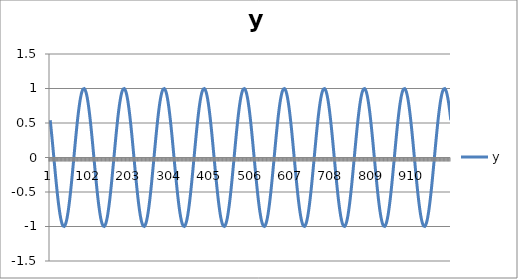
| Category | y |
|---|---|
| 0 | 0.54 |
| 1 | 0.486 |
| 2 | 0.431 |
| 3 | 0.373 |
| 4 | 0.314 |
| 5 | 0.254 |
| 6 | 0.193 |
| 7 | 0.131 |
| 8 | 0.068 |
| 9 | 0.005 |
| 10 | -0.057 |
| 11 | -0.12 |
| 12 | -0.182 |
| 13 | -0.244 |
| 14 | -0.304 |
| 15 | -0.363 |
| 16 | -0.421 |
| 17 | -0.477 |
| 18 | -0.531 |
| 19 | -0.583 |
| 20 | -0.633 |
| 21 | -0.681 |
| 22 | -0.725 |
| 23 | -0.767 |
| 24 | -0.806 |
| 25 | -0.841 |
| 26 | -0.874 |
| 27 | -0.903 |
| 28 | -0.928 |
| 29 | -0.949 |
| 30 | -0.967 |
| 31 | -0.981 |
| 32 | -0.991 |
| 33 | -0.998 |
| 34 | -1 |
| 35 | -0.998 |
| 36 | -0.993 |
| 37 | -0.983 |
| 38 | -0.97 |
| 39 | -0.953 |
| 40 | -0.932 |
| 41 | -0.907 |
| 42 | -0.879 |
| 43 | -0.847 |
| 44 | -0.812 |
| 45 | -0.774 |
| 46 | -0.733 |
| 47 | -0.688 |
| 48 | -0.642 |
| 49 | -0.592 |
| 50 | -0.54 |
| 51 | -0.486 |
| 52 | -0.431 |
| 53 | -0.373 |
| 54 | -0.314 |
| 55 | -0.254 |
| 56 | -0.193 |
| 57 | -0.131 |
| 58 | -0.068 |
| 59 | -0.005 |
| 60 | 0.057 |
| 61 | 0.12 |
| 62 | 0.182 |
| 63 | 0.244 |
| 64 | 0.304 |
| 65 | 0.363 |
| 66 | 0.421 |
| 67 | 0.477 |
| 68 | 0.531 |
| 69 | 0.583 |
| 70 | 0.633 |
| 71 | 0.681 |
| 72 | 0.725 |
| 73 | 0.767 |
| 74 | 0.806 |
| 75 | 0.841 |
| 76 | 0.874 |
| 77 | 0.903 |
| 78 | 0.928 |
| 79 | 0.949 |
| 80 | 0.967 |
| 81 | 0.981 |
| 82 | 0.991 |
| 83 | 0.998 |
| 84 | 1 |
| 85 | 0.998 |
| 86 | 0.993 |
| 87 | 0.983 |
| 88 | 0.97 |
| 89 | 0.953 |
| 90 | 0.932 |
| 91 | 0.907 |
| 92 | 0.879 |
| 93 | 0.847 |
| 94 | 0.812 |
| 95 | 0.774 |
| 96 | 0.733 |
| 97 | 0.688 |
| 98 | 0.642 |
| 99 | 0.592 |
| 100 | 0.54 |
| 101 | 0.486 |
| 102 | 0.431 |
| 103 | 0.373 |
| 104 | 0.314 |
| 105 | 0.254 |
| 106 | 0.193 |
| 107 | 0.131 |
| 108 | 0.068 |
| 109 | 0.005 |
| 110 | -0.057 |
| 111 | -0.12 |
| 112 | -0.182 |
| 113 | -0.244 |
| 114 | -0.304 |
| 115 | -0.363 |
| 116 | -0.421 |
| 117 | -0.477 |
| 118 | -0.531 |
| 119 | -0.583 |
| 120 | -0.633 |
| 121 | -0.681 |
| 122 | -0.725 |
| 123 | -0.767 |
| 124 | -0.806 |
| 125 | -0.841 |
| 126 | -0.874 |
| 127 | -0.903 |
| 128 | -0.928 |
| 129 | -0.949 |
| 130 | -0.967 |
| 131 | -0.981 |
| 132 | -0.991 |
| 133 | -0.998 |
| 134 | -1 |
| 135 | -0.998 |
| 136 | -0.993 |
| 137 | -0.983 |
| 138 | -0.97 |
| 139 | -0.953 |
| 140 | -0.932 |
| 141 | -0.907 |
| 142 | -0.879 |
| 143 | -0.847 |
| 144 | -0.812 |
| 145 | -0.774 |
| 146 | -0.733 |
| 147 | -0.688 |
| 148 | -0.642 |
| 149 | -0.592 |
| 150 | -0.54 |
| 151 | -0.486 |
| 152 | -0.431 |
| 153 | -0.373 |
| 154 | -0.314 |
| 155 | -0.254 |
| 156 | -0.193 |
| 157 | -0.131 |
| 158 | -0.068 |
| 159 | -0.005 |
| 160 | 0.057 |
| 161 | 0.12 |
| 162 | 0.182 |
| 163 | 0.244 |
| 164 | 0.304 |
| 165 | 0.363 |
| 166 | 0.421 |
| 167 | 0.477 |
| 168 | 0.531 |
| 169 | 0.583 |
| 170 | 0.633 |
| 171 | 0.681 |
| 172 | 0.725 |
| 173 | 0.767 |
| 174 | 0.806 |
| 175 | 0.841 |
| 176 | 0.874 |
| 177 | 0.903 |
| 178 | 0.928 |
| 179 | 0.949 |
| 180 | 0.967 |
| 181 | 0.981 |
| 182 | 0.991 |
| 183 | 0.998 |
| 184 | 1 |
| 185 | 0.998 |
| 186 | 0.993 |
| 187 | 0.983 |
| 188 | 0.97 |
| 189 | 0.953 |
| 190 | 0.932 |
| 191 | 0.907 |
| 192 | 0.879 |
| 193 | 0.847 |
| 194 | 0.812 |
| 195 | 0.774 |
| 196 | 0.733 |
| 197 | 0.688 |
| 198 | 0.642 |
| 199 | 0.592 |
| 200 | 0.54 |
| 201 | 0.486 |
| 202 | 0.431 |
| 203 | 0.373 |
| 204 | 0.314 |
| 205 | 0.254 |
| 206 | 0.193 |
| 207 | 0.131 |
| 208 | 0.068 |
| 209 | 0.005 |
| 210 | -0.057 |
| 211 | -0.12 |
| 212 | -0.182 |
| 213 | -0.244 |
| 214 | -0.304 |
| 215 | -0.363 |
| 216 | -0.421 |
| 217 | -0.477 |
| 218 | -0.531 |
| 219 | -0.583 |
| 220 | -0.633 |
| 221 | -0.681 |
| 222 | -0.725 |
| 223 | -0.767 |
| 224 | -0.806 |
| 225 | -0.841 |
| 226 | -0.874 |
| 227 | -0.903 |
| 228 | -0.928 |
| 229 | -0.949 |
| 230 | -0.967 |
| 231 | -0.981 |
| 232 | -0.991 |
| 233 | -0.998 |
| 234 | -1 |
| 235 | -0.998 |
| 236 | -0.993 |
| 237 | -0.983 |
| 238 | -0.97 |
| 239 | -0.953 |
| 240 | -0.932 |
| 241 | -0.907 |
| 242 | -0.879 |
| 243 | -0.847 |
| 244 | -0.812 |
| 245 | -0.774 |
| 246 | -0.733 |
| 247 | -0.688 |
| 248 | -0.642 |
| 249 | -0.592 |
| 250 | -0.54 |
| 251 | -0.486 |
| 252 | -0.431 |
| 253 | -0.373 |
| 254 | -0.314 |
| 255 | -0.254 |
| 256 | -0.193 |
| 257 | -0.131 |
| 258 | -0.068 |
| 259 | -0.005 |
| 260 | 0.057 |
| 261 | 0.12 |
| 262 | 0.182 |
| 263 | 0.244 |
| 264 | 0.304 |
| 265 | 0.363 |
| 266 | 0.421 |
| 267 | 0.477 |
| 268 | 0.531 |
| 269 | 0.583 |
| 270 | 0.633 |
| 271 | 0.681 |
| 272 | 0.725 |
| 273 | 0.767 |
| 274 | 0.806 |
| 275 | 0.841 |
| 276 | 0.874 |
| 277 | 0.903 |
| 278 | 0.928 |
| 279 | 0.949 |
| 280 | 0.967 |
| 281 | 0.981 |
| 282 | 0.991 |
| 283 | 0.998 |
| 284 | 1 |
| 285 | 0.998 |
| 286 | 0.993 |
| 287 | 0.983 |
| 288 | 0.97 |
| 289 | 0.953 |
| 290 | 0.932 |
| 291 | 0.907 |
| 292 | 0.879 |
| 293 | 0.847 |
| 294 | 0.812 |
| 295 | 0.774 |
| 296 | 0.733 |
| 297 | 0.688 |
| 298 | 0.642 |
| 299 | 0.592 |
| 300 | 0.54 |
| 301 | 0.486 |
| 302 | 0.431 |
| 303 | 0.373 |
| 304 | 0.314 |
| 305 | 0.254 |
| 306 | 0.193 |
| 307 | 0.131 |
| 308 | 0.068 |
| 309 | 0.005 |
| 310 | -0.057 |
| 311 | -0.12 |
| 312 | -0.182 |
| 313 | -0.244 |
| 314 | -0.304 |
| 315 | -0.363 |
| 316 | -0.421 |
| 317 | -0.477 |
| 318 | -0.531 |
| 319 | -0.583 |
| 320 | -0.633 |
| 321 | -0.681 |
| 322 | -0.725 |
| 323 | -0.767 |
| 324 | -0.806 |
| 325 | -0.841 |
| 326 | -0.874 |
| 327 | -0.903 |
| 328 | -0.928 |
| 329 | -0.949 |
| 330 | -0.967 |
| 331 | -0.981 |
| 332 | -0.991 |
| 333 | -0.998 |
| 334 | -1 |
| 335 | -0.998 |
| 336 | -0.993 |
| 337 | -0.983 |
| 338 | -0.97 |
| 339 | -0.953 |
| 340 | -0.932 |
| 341 | -0.907 |
| 342 | -0.879 |
| 343 | -0.847 |
| 344 | -0.812 |
| 345 | -0.774 |
| 346 | -0.733 |
| 347 | -0.688 |
| 348 | -0.642 |
| 349 | -0.592 |
| 350 | -0.54 |
| 351 | -0.486 |
| 352 | -0.431 |
| 353 | -0.373 |
| 354 | -0.314 |
| 355 | -0.254 |
| 356 | -0.193 |
| 357 | -0.131 |
| 358 | -0.068 |
| 359 | -0.005 |
| 360 | 0.057 |
| 361 | 0.12 |
| 362 | 0.182 |
| 363 | 0.244 |
| 364 | 0.304 |
| 365 | 0.363 |
| 366 | 0.421 |
| 367 | 0.477 |
| 368 | 0.531 |
| 369 | 0.583 |
| 370 | 0.633 |
| 371 | 0.681 |
| 372 | 0.725 |
| 373 | 0.767 |
| 374 | 0.806 |
| 375 | 0.841 |
| 376 | 0.874 |
| 377 | 0.903 |
| 378 | 0.928 |
| 379 | 0.949 |
| 380 | 0.967 |
| 381 | 0.981 |
| 382 | 0.991 |
| 383 | 0.998 |
| 384 | 1 |
| 385 | 0.998 |
| 386 | 0.993 |
| 387 | 0.983 |
| 388 | 0.97 |
| 389 | 0.953 |
| 390 | 0.932 |
| 391 | 0.907 |
| 392 | 0.879 |
| 393 | 0.847 |
| 394 | 0.812 |
| 395 | 0.774 |
| 396 | 0.733 |
| 397 | 0.688 |
| 398 | 0.642 |
| 399 | 0.592 |
| 400 | 0.54 |
| 401 | 0.486 |
| 402 | 0.431 |
| 403 | 0.373 |
| 404 | 0.314 |
| 405 | 0.254 |
| 406 | 0.193 |
| 407 | 0.131 |
| 408 | 0.068 |
| 409 | 0.005 |
| 410 | -0.057 |
| 411 | -0.12 |
| 412 | -0.182 |
| 413 | -0.244 |
| 414 | -0.304 |
| 415 | -0.363 |
| 416 | -0.421 |
| 417 | -0.477 |
| 418 | -0.531 |
| 419 | -0.583 |
| 420 | -0.633 |
| 421 | -0.681 |
| 422 | -0.725 |
| 423 | -0.767 |
| 424 | -0.806 |
| 425 | -0.841 |
| 426 | -0.874 |
| 427 | -0.903 |
| 428 | -0.928 |
| 429 | -0.949 |
| 430 | -0.967 |
| 431 | -0.981 |
| 432 | -0.991 |
| 433 | -0.998 |
| 434 | -1 |
| 435 | -0.998 |
| 436 | -0.993 |
| 437 | -0.983 |
| 438 | -0.97 |
| 439 | -0.953 |
| 440 | -0.932 |
| 441 | -0.907 |
| 442 | -0.879 |
| 443 | -0.847 |
| 444 | -0.812 |
| 445 | -0.774 |
| 446 | -0.733 |
| 447 | -0.688 |
| 448 | -0.642 |
| 449 | -0.592 |
| 450 | -0.54 |
| 451 | -0.486 |
| 452 | -0.431 |
| 453 | -0.373 |
| 454 | -0.314 |
| 455 | -0.254 |
| 456 | -0.193 |
| 457 | -0.131 |
| 458 | -0.068 |
| 459 | -0.005 |
| 460 | 0.057 |
| 461 | 0.12 |
| 462 | 0.182 |
| 463 | 0.244 |
| 464 | 0.304 |
| 465 | 0.363 |
| 466 | 0.421 |
| 467 | 0.477 |
| 468 | 0.531 |
| 469 | 0.583 |
| 470 | 0.633 |
| 471 | 0.681 |
| 472 | 0.725 |
| 473 | 0.767 |
| 474 | 0.806 |
| 475 | 0.841 |
| 476 | 0.874 |
| 477 | 0.903 |
| 478 | 0.928 |
| 479 | 0.949 |
| 480 | 0.967 |
| 481 | 0.981 |
| 482 | 0.991 |
| 483 | 0.998 |
| 484 | 1 |
| 485 | 0.998 |
| 486 | 0.993 |
| 487 | 0.983 |
| 488 | 0.97 |
| 489 | 0.953 |
| 490 | 0.932 |
| 491 | 0.907 |
| 492 | 0.879 |
| 493 | 0.847 |
| 494 | 0.812 |
| 495 | 0.774 |
| 496 | 0.733 |
| 497 | 0.688 |
| 498 | 0.642 |
| 499 | 0.592 |
| 500 | 0.54 |
| 501 | 0.486 |
| 502 | 0.431 |
| 503 | 0.373 |
| 504 | 0.314 |
| 505 | 0.254 |
| 506 | 0.193 |
| 507 | 0.131 |
| 508 | 0.068 |
| 509 | 0.005 |
| 510 | -0.057 |
| 511 | -0.12 |
| 512 | -0.182 |
| 513 | -0.244 |
| 514 | -0.304 |
| 515 | -0.363 |
| 516 | -0.421 |
| 517 | -0.477 |
| 518 | -0.531 |
| 519 | -0.583 |
| 520 | -0.633 |
| 521 | -0.681 |
| 522 | -0.725 |
| 523 | -0.767 |
| 524 | -0.806 |
| 525 | -0.841 |
| 526 | -0.874 |
| 527 | -0.903 |
| 528 | -0.928 |
| 529 | -0.949 |
| 530 | -0.967 |
| 531 | -0.981 |
| 532 | -0.991 |
| 533 | -0.998 |
| 534 | -1 |
| 535 | -0.998 |
| 536 | -0.993 |
| 537 | -0.983 |
| 538 | -0.97 |
| 539 | -0.953 |
| 540 | -0.932 |
| 541 | -0.907 |
| 542 | -0.879 |
| 543 | -0.847 |
| 544 | -0.812 |
| 545 | -0.774 |
| 546 | -0.733 |
| 547 | -0.688 |
| 548 | -0.642 |
| 549 | -0.592 |
| 550 | -0.54 |
| 551 | -0.486 |
| 552 | -0.431 |
| 553 | -0.373 |
| 554 | -0.314 |
| 555 | -0.254 |
| 556 | -0.193 |
| 557 | -0.131 |
| 558 | -0.068 |
| 559 | -0.005 |
| 560 | 0.057 |
| 561 | 0.12 |
| 562 | 0.182 |
| 563 | 0.244 |
| 564 | 0.304 |
| 565 | 0.363 |
| 566 | 0.421 |
| 567 | 0.477 |
| 568 | 0.531 |
| 569 | 0.583 |
| 570 | 0.633 |
| 571 | 0.681 |
| 572 | 0.725 |
| 573 | 0.767 |
| 574 | 0.806 |
| 575 | 0.841 |
| 576 | 0.874 |
| 577 | 0.903 |
| 578 | 0.928 |
| 579 | 0.949 |
| 580 | 0.967 |
| 581 | 0.981 |
| 582 | 0.991 |
| 583 | 0.998 |
| 584 | 1 |
| 585 | 0.998 |
| 586 | 0.993 |
| 587 | 0.983 |
| 588 | 0.97 |
| 589 | 0.953 |
| 590 | 0.932 |
| 591 | 0.907 |
| 592 | 0.879 |
| 593 | 0.847 |
| 594 | 0.812 |
| 595 | 0.774 |
| 596 | 0.733 |
| 597 | 0.688 |
| 598 | 0.642 |
| 599 | 0.592 |
| 600 | 0.54 |
| 601 | 0.486 |
| 602 | 0.431 |
| 603 | 0.373 |
| 604 | 0.314 |
| 605 | 0.254 |
| 606 | 0.193 |
| 607 | 0.131 |
| 608 | 0.068 |
| 609 | 0.005 |
| 610 | -0.057 |
| 611 | -0.12 |
| 612 | -0.182 |
| 613 | -0.244 |
| 614 | -0.304 |
| 615 | -0.363 |
| 616 | -0.421 |
| 617 | -0.477 |
| 618 | -0.531 |
| 619 | -0.583 |
| 620 | -0.633 |
| 621 | -0.681 |
| 622 | -0.725 |
| 623 | -0.767 |
| 624 | -0.806 |
| 625 | -0.841 |
| 626 | -0.874 |
| 627 | -0.903 |
| 628 | -0.928 |
| 629 | -0.949 |
| 630 | -0.967 |
| 631 | -0.981 |
| 632 | -0.991 |
| 633 | -0.998 |
| 634 | -1 |
| 635 | -0.998 |
| 636 | -0.993 |
| 637 | -0.983 |
| 638 | -0.97 |
| 639 | -0.953 |
| 640 | -0.932 |
| 641 | -0.907 |
| 642 | -0.879 |
| 643 | -0.847 |
| 644 | -0.812 |
| 645 | -0.774 |
| 646 | -0.733 |
| 647 | -0.688 |
| 648 | -0.642 |
| 649 | -0.592 |
| 650 | -0.54 |
| 651 | -0.486 |
| 652 | -0.431 |
| 653 | -0.373 |
| 654 | -0.314 |
| 655 | -0.254 |
| 656 | -0.193 |
| 657 | -0.131 |
| 658 | -0.068 |
| 659 | -0.005 |
| 660 | 0.057 |
| 661 | 0.12 |
| 662 | 0.182 |
| 663 | 0.244 |
| 664 | 0.304 |
| 665 | 0.363 |
| 666 | 0.421 |
| 667 | 0.477 |
| 668 | 0.531 |
| 669 | 0.583 |
| 670 | 0.633 |
| 671 | 0.681 |
| 672 | 0.725 |
| 673 | 0.767 |
| 674 | 0.806 |
| 675 | 0.841 |
| 676 | 0.874 |
| 677 | 0.903 |
| 678 | 0.928 |
| 679 | 0.949 |
| 680 | 0.967 |
| 681 | 0.981 |
| 682 | 0.991 |
| 683 | 0.998 |
| 684 | 1 |
| 685 | 0.998 |
| 686 | 0.993 |
| 687 | 0.983 |
| 688 | 0.97 |
| 689 | 0.953 |
| 690 | 0.932 |
| 691 | 0.907 |
| 692 | 0.879 |
| 693 | 0.847 |
| 694 | 0.812 |
| 695 | 0.774 |
| 696 | 0.733 |
| 697 | 0.688 |
| 698 | 0.642 |
| 699 | 0.592 |
| 700 | 0.54 |
| 701 | 0.486 |
| 702 | 0.431 |
| 703 | 0.373 |
| 704 | 0.314 |
| 705 | 0.254 |
| 706 | 0.193 |
| 707 | 0.131 |
| 708 | 0.068 |
| 709 | 0.005 |
| 710 | -0.057 |
| 711 | -0.12 |
| 712 | -0.182 |
| 713 | -0.244 |
| 714 | -0.304 |
| 715 | -0.363 |
| 716 | -0.421 |
| 717 | -0.477 |
| 718 | -0.531 |
| 719 | -0.583 |
| 720 | -0.633 |
| 721 | -0.681 |
| 722 | -0.725 |
| 723 | -0.767 |
| 724 | -0.806 |
| 725 | -0.841 |
| 726 | -0.874 |
| 727 | -0.903 |
| 728 | -0.928 |
| 729 | -0.949 |
| 730 | -0.967 |
| 731 | -0.981 |
| 732 | -0.991 |
| 733 | -0.998 |
| 734 | -1 |
| 735 | -0.998 |
| 736 | -0.993 |
| 737 | -0.983 |
| 738 | -0.97 |
| 739 | -0.953 |
| 740 | -0.932 |
| 741 | -0.907 |
| 742 | -0.879 |
| 743 | -0.847 |
| 744 | -0.812 |
| 745 | -0.774 |
| 746 | -0.733 |
| 747 | -0.688 |
| 748 | -0.642 |
| 749 | -0.592 |
| 750 | -0.54 |
| 751 | -0.486 |
| 752 | -0.431 |
| 753 | -0.373 |
| 754 | -0.314 |
| 755 | -0.254 |
| 756 | -0.193 |
| 757 | -0.131 |
| 758 | -0.068 |
| 759 | -0.005 |
| 760 | 0.057 |
| 761 | 0.12 |
| 762 | 0.182 |
| 763 | 0.244 |
| 764 | 0.304 |
| 765 | 0.363 |
| 766 | 0.421 |
| 767 | 0.477 |
| 768 | 0.531 |
| 769 | 0.583 |
| 770 | 0.633 |
| 771 | 0.681 |
| 772 | 0.725 |
| 773 | 0.767 |
| 774 | 0.806 |
| 775 | 0.841 |
| 776 | 0.874 |
| 777 | 0.903 |
| 778 | 0.928 |
| 779 | 0.949 |
| 780 | 0.967 |
| 781 | 0.981 |
| 782 | 0.991 |
| 783 | 0.998 |
| 784 | 1 |
| 785 | 0.998 |
| 786 | 0.993 |
| 787 | 0.983 |
| 788 | 0.97 |
| 789 | 0.953 |
| 790 | 0.932 |
| 791 | 0.907 |
| 792 | 0.879 |
| 793 | 0.847 |
| 794 | 0.812 |
| 795 | 0.774 |
| 796 | 0.733 |
| 797 | 0.688 |
| 798 | 0.642 |
| 799 | 0.592 |
| 800 | 0.54 |
| 801 | 0.486 |
| 802 | 0.431 |
| 803 | 0.373 |
| 804 | 0.314 |
| 805 | 0.254 |
| 806 | 0.193 |
| 807 | 0.131 |
| 808 | 0.068 |
| 809 | 0.005 |
| 810 | -0.057 |
| 811 | -0.12 |
| 812 | -0.182 |
| 813 | -0.244 |
| 814 | -0.304 |
| 815 | -0.363 |
| 816 | -0.421 |
| 817 | -0.477 |
| 818 | -0.531 |
| 819 | -0.583 |
| 820 | -0.633 |
| 821 | -0.681 |
| 822 | -0.725 |
| 823 | -0.767 |
| 824 | -0.806 |
| 825 | -0.841 |
| 826 | -0.874 |
| 827 | -0.903 |
| 828 | -0.928 |
| 829 | -0.949 |
| 830 | -0.967 |
| 831 | -0.981 |
| 832 | -0.991 |
| 833 | -0.998 |
| 834 | -1 |
| 835 | -0.998 |
| 836 | -0.993 |
| 837 | -0.983 |
| 838 | -0.97 |
| 839 | -0.953 |
| 840 | -0.932 |
| 841 | -0.907 |
| 842 | -0.879 |
| 843 | -0.847 |
| 844 | -0.812 |
| 845 | -0.774 |
| 846 | -0.733 |
| 847 | -0.688 |
| 848 | -0.642 |
| 849 | -0.592 |
| 850 | -0.54 |
| 851 | -0.486 |
| 852 | -0.431 |
| 853 | -0.373 |
| 854 | -0.314 |
| 855 | -0.254 |
| 856 | -0.193 |
| 857 | -0.131 |
| 858 | -0.068 |
| 859 | -0.005 |
| 860 | 0.057 |
| 861 | 0.12 |
| 862 | 0.182 |
| 863 | 0.244 |
| 864 | 0.304 |
| 865 | 0.363 |
| 866 | 0.421 |
| 867 | 0.477 |
| 868 | 0.531 |
| 869 | 0.583 |
| 870 | 0.633 |
| 871 | 0.681 |
| 872 | 0.725 |
| 873 | 0.767 |
| 874 | 0.806 |
| 875 | 0.841 |
| 876 | 0.874 |
| 877 | 0.903 |
| 878 | 0.928 |
| 879 | 0.949 |
| 880 | 0.967 |
| 881 | 0.981 |
| 882 | 0.991 |
| 883 | 0.998 |
| 884 | 1 |
| 885 | 0.998 |
| 886 | 0.993 |
| 887 | 0.983 |
| 888 | 0.97 |
| 889 | 0.953 |
| 890 | 0.932 |
| 891 | 0.907 |
| 892 | 0.879 |
| 893 | 0.847 |
| 894 | 0.812 |
| 895 | 0.774 |
| 896 | 0.733 |
| 897 | 0.688 |
| 898 | 0.642 |
| 899 | 0.592 |
| 900 | 0.54 |
| 901 | 0.486 |
| 902 | 0.431 |
| 903 | 0.373 |
| 904 | 0.314 |
| 905 | 0.254 |
| 906 | 0.193 |
| 907 | 0.131 |
| 908 | 0.068 |
| 909 | 0.005 |
| 910 | -0.057 |
| 911 | -0.12 |
| 912 | -0.182 |
| 913 | -0.244 |
| 914 | -0.304 |
| 915 | -0.363 |
| 916 | -0.421 |
| 917 | -0.477 |
| 918 | -0.531 |
| 919 | -0.583 |
| 920 | -0.633 |
| 921 | -0.681 |
| 922 | -0.725 |
| 923 | -0.767 |
| 924 | -0.806 |
| 925 | -0.841 |
| 926 | -0.874 |
| 927 | -0.903 |
| 928 | -0.928 |
| 929 | -0.949 |
| 930 | -0.967 |
| 931 | -0.981 |
| 932 | -0.991 |
| 933 | -0.998 |
| 934 | -1 |
| 935 | -0.998 |
| 936 | -0.993 |
| 937 | -0.983 |
| 938 | -0.97 |
| 939 | -0.953 |
| 940 | -0.932 |
| 941 | -0.907 |
| 942 | -0.879 |
| 943 | -0.847 |
| 944 | -0.812 |
| 945 | -0.774 |
| 946 | -0.733 |
| 947 | -0.688 |
| 948 | -0.642 |
| 949 | -0.592 |
| 950 | -0.54 |
| 951 | -0.486 |
| 952 | -0.431 |
| 953 | -0.373 |
| 954 | -0.314 |
| 955 | -0.254 |
| 956 | -0.193 |
| 957 | -0.131 |
| 958 | -0.068 |
| 959 | -0.005 |
| 960 | 0.057 |
| 961 | 0.12 |
| 962 | 0.182 |
| 963 | 0.244 |
| 964 | 0.304 |
| 965 | 0.363 |
| 966 | 0.421 |
| 967 | 0.477 |
| 968 | 0.531 |
| 969 | 0.583 |
| 970 | 0.633 |
| 971 | 0.681 |
| 972 | 0.725 |
| 973 | 0.767 |
| 974 | 0.806 |
| 975 | 0.841 |
| 976 | 0.874 |
| 977 | 0.903 |
| 978 | 0.928 |
| 979 | 0.949 |
| 980 | 0.967 |
| 981 | 0.981 |
| 982 | 0.991 |
| 983 | 0.998 |
| 984 | 1 |
| 985 | 0.998 |
| 986 | 0.993 |
| 987 | 0.983 |
| 988 | 0.97 |
| 989 | 0.953 |
| 990 | 0.932 |
| 991 | 0.907 |
| 992 | 0.879 |
| 993 | 0.847 |
| 994 | 0.812 |
| 995 | 0.774 |
| 996 | 0.733 |
| 997 | 0.688 |
| 998 | 0.642 |
| 999 | 0.592 |
| 1000 | 0.54 |